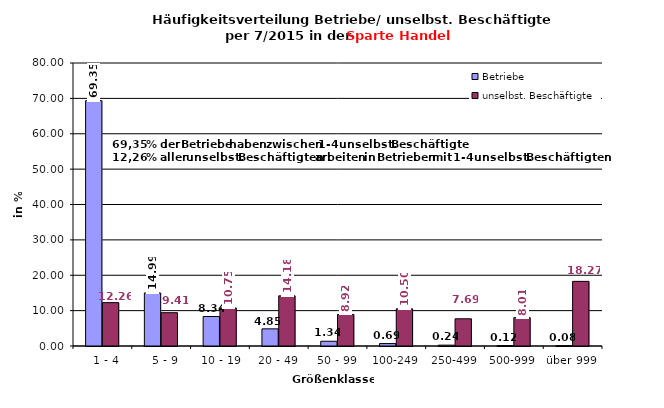
| Category | Betriebe | unselbst. Beschäftigte |
|---|---|---|
|   1 - 4 | 69.352 | 12.261 |
|   5 - 9 | 14.991 | 9.41 |
|  10 - 19 | 8.338 | 10.754 |
| 20 - 49 | 4.849 | 14.178 |
| 50 - 99 | 1.341 | 8.92 |
| 100-249 | 0.686 | 10.497 |
| 250-499 | 0.242 | 7.692 |
| 500-999 | 0.121 | 8.015 |
| über 999 | 0.081 | 18.272 |